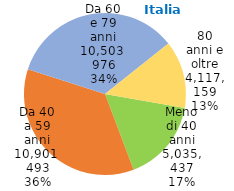
| Category | Series 0 |
|---|---|
| Meno di 40 anni | 5035437 |
| Da 40 a 59 anni | 10901493 |
| Da 60 e 79 anni | 10503976 |
| 80 anni e oltre | 4117159 |